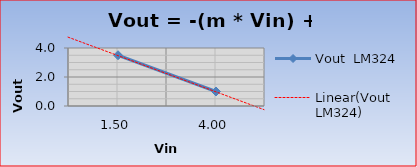
| Category | Vout  LM324 |
|---|---|
| 1.5 | 3.5 |
| 4.0 | 1 |